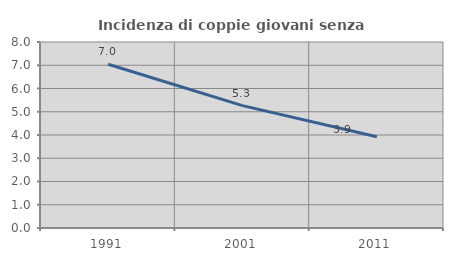
| Category | Incidenza di coppie giovani senza figli |
|---|---|
| 1991.0 | 7.042 |
| 2001.0 | 5.263 |
| 2011.0 | 3.922 |